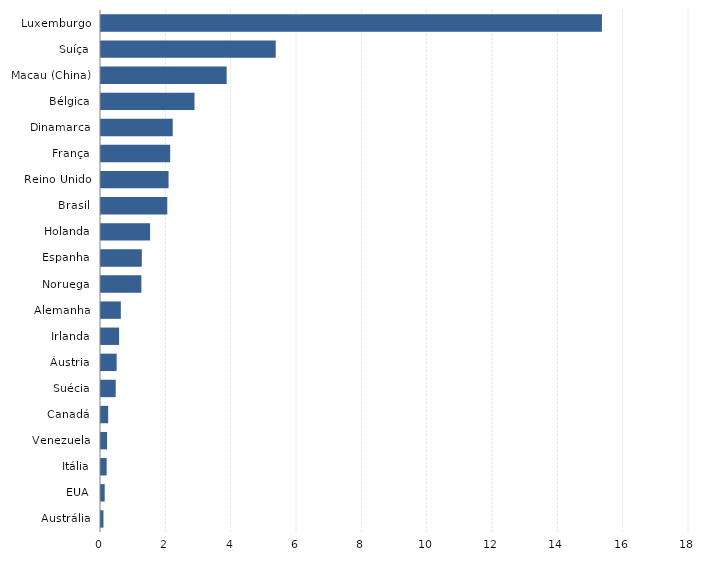
| Category | Series 0 |
|---|---|
| Austrália | 0.075 |
| EUA | 0.113 |
| Itália | 0.173 |
| Venezuela | 0.185 |
| Canadá | 0.219 |
| Suécia | 0.45 |
| Áustria | 0.479 |
| Irlanda | 0.554 |
| Alemanha | 0.607 |
| Noruega | 1.236 |
| Espanha | 1.249 |
| Holanda | 1.503 |
| Brasil | 2.029 |
| Reino Unido | 2.068 |
| França | 2.118 |
| Dinamarca | 2.196 |
| Bélgica | 2.863 |
| Macau (China) | 3.846 |
| Suíça | 5.348 |
| Luxemburgo | 15.335 |